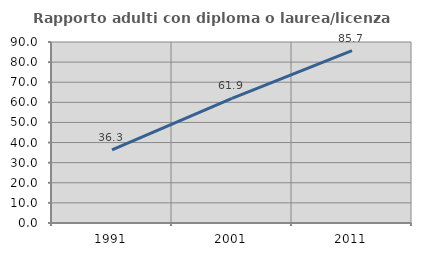
| Category | Rapporto adulti con diploma o laurea/licenza media  |
|---|---|
| 1991.0 | 36.318 |
| 2001.0 | 61.929 |
| 2011.0 | 85.714 |